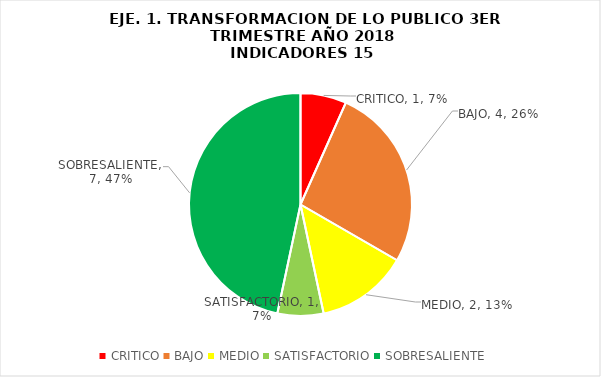
| Category | Series 0 |
|---|---|
| CRITICO | 1 |
| BAJO | 4 |
| MEDIO | 2 |
| SATISFACTORIO | 1 |
| SOBRESALIENTE | 7 |